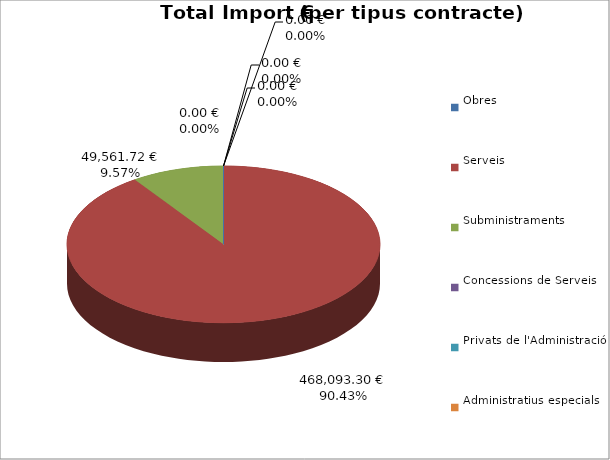
| Category | Total preu
(amb IVA) |
|---|---|
| Obres | 0 |
| Serveis | 468093.3 |
| Subministraments | 49561.72 |
| Concessions de Serveis | 0 |
| Privats de l'Administració | 0 |
| Administratius especials | 0 |